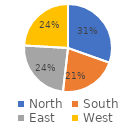
| Category | Q4 |
|---|---|
| North | 125 |
| South | 88 |
| East | 99 |
| West | 99 |